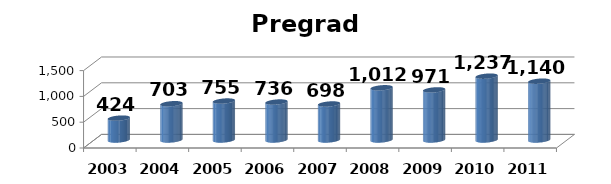
| Category | Pregrado |
|---|---|
| 2003.0 | 424 |
| 2004.0 | 703 |
| 2005.0 | 755 |
| 2006.0 | 736 |
| 2007.0 | 698 |
| 2008.0 | 1012 |
| 2009.0 | 971 |
| 2010.0 | 1237 |
| 2011.0 | 1140 |